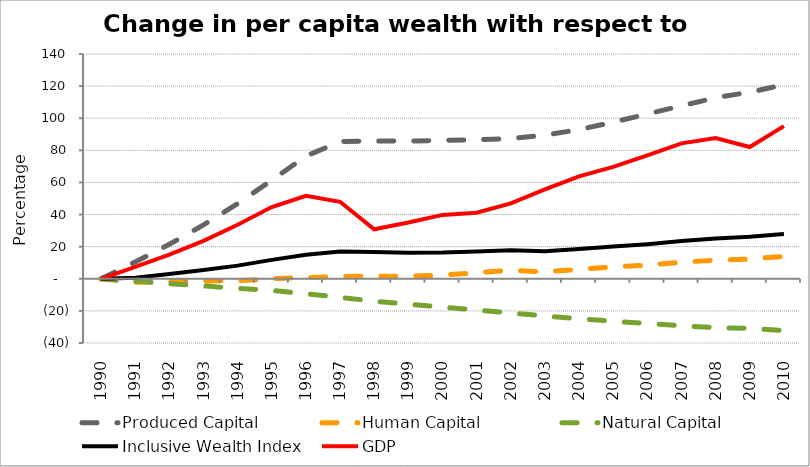
| Category | Produced Capital  | Human Capital | Natural Capital | Inclusive Wealth Index | GDP |
|---|---|---|---|---|---|
| 1990.0 | 0 | 0 | 0 | 0 | 0 |
| 1991.0 | 10.45 | -2.205 | -1.404 | 0.665 | 7.383 |
| 1992.0 | 21.497 | -1.761 | -2.998 | 2.985 | 15.03 |
| 1993.0 | 33.538 | -1.425 | -4.459 | 5.479 | 23.576 |
| 1994.0 | 46.865 | -1.19 | -5.944 | 8.185 | 33.645 |
| 1995.0 | 61.427 | 0.035 | -7.228 | 11.779 | 44.709 |
| 1996.0 | 76.371 | 0.777 | -9.303 | 15.016 | 51.703 |
| 1997.0 | 85.484 | 1.46 | -11.625 | 16.918 | 47.963 |
| 1998.0 | 85.894 | 1.56 | -13.931 | 16.614 | 30.852 |
| 1999.0 | 85.811 | 1.501 | -15.737 | 16.208 | 35.033 |
| 2000.0 | 86.165 | 2.325 | -17.741 | 16.379 | 39.776 |
| 2001.0 | 86.528 | 3.843 | -19.442 | 17.019 | 41.143 |
| 2002.0 | 87.422 | 5.32 | -21.322 | 17.714 | 46.937 |
| 2003.0 | 89.466 | 4.305 | -23.206 | 17.185 | 55.677 |
| 2004.0 | 92.913 | 5.888 | -24.836 | 18.539 | 63.823 |
| 2005.0 | 97.576 | 7.327 | -26.384 | 20.085 | 69.728 |
| 2006.0 | 102.615 | 8.452 | -27.835 | 21.545 | 76.839 |
| 2007.0 | 107.698 | 10.335 | -29.243 | 23.471 | 84.335 |
| 2008.0 | 112.762 | 11.6 | -30.456 | 25.066 | 87.609 |
| 2009.0 | 116.25 | 12.281 | -30.919 | 26.125 | 82.07 |
| 2010.0 | 120.808 | 13.978 | -32.249 | 27.843 | 95.096 |